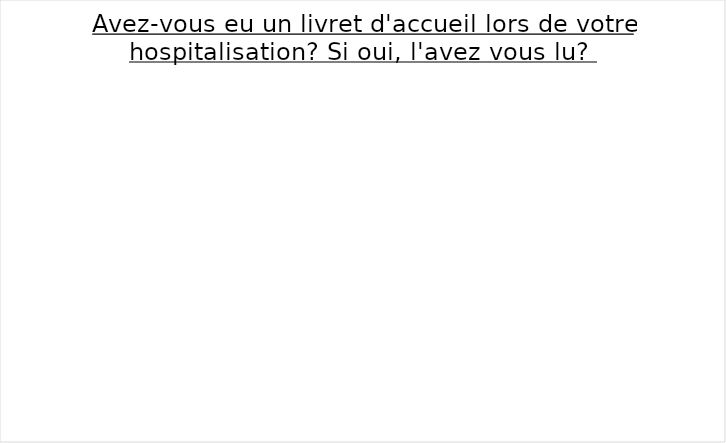
| Category | Series 0 |
|---|---|
| Non | 0 |
| Je ne me souviens pas  | 0 |
| Non concerné  | 0 |
| Lu | 0 |
| Non lu  | 0 |